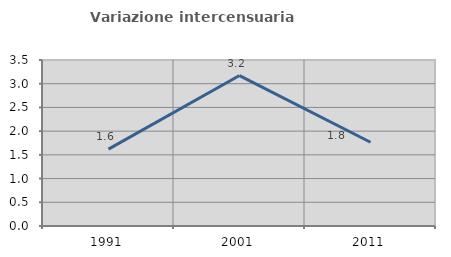
| Category | Variazione intercensuaria annua |
|---|---|
| 1991.0 | 1.62 |
| 2001.0 | 3.172 |
| 2011.0 | 1.767 |